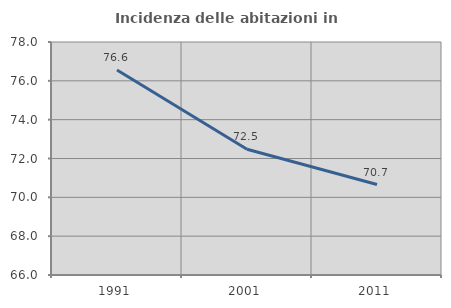
| Category | Incidenza delle abitazioni in proprietà  |
|---|---|
| 1991.0 | 76.559 |
| 2001.0 | 72.477 |
| 2011.0 | 70.658 |